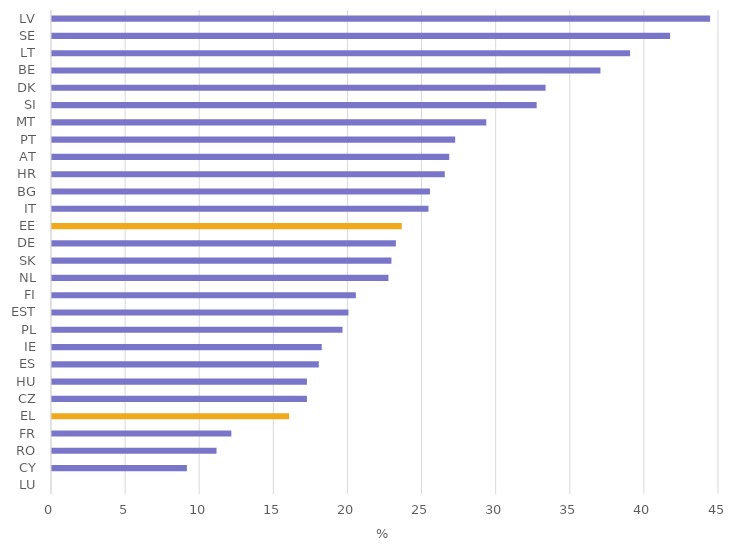
| Category | Series 0 |
|---|---|
| LU | 0 |
| CY | 9.1 |
| RO | 11.1 |
| FR | 12.1 |
| EL | 16 |
| CZ | 17.2 |
| HU | 17.2 |
| ES | 18 |
| IE | 18.2 |
| PL | 19.6 |
| EST | 20 |
| FI | 20.5 |
| NL | 22.7 |
| SK | 22.9 |
| DE | 23.2 |
| ΕΕ | 23.6 |
| IT | 25.4 |
| BG | 25.5 |
| HR | 26.5 |
| AT | 26.8 |
| PT | 27.2 |
| MT | 29.3 |
| SI | 32.7 |
| DK | 33.3 |
| BE | 37 |
| LT | 39 |
| SE | 41.7 |
| LV | 44.4 |